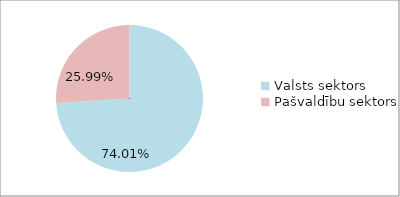
| Category | Series 0 |
|---|---|
| Valsts sektors | 0.74 |
| Pašvaldību sektors | 0.26 |